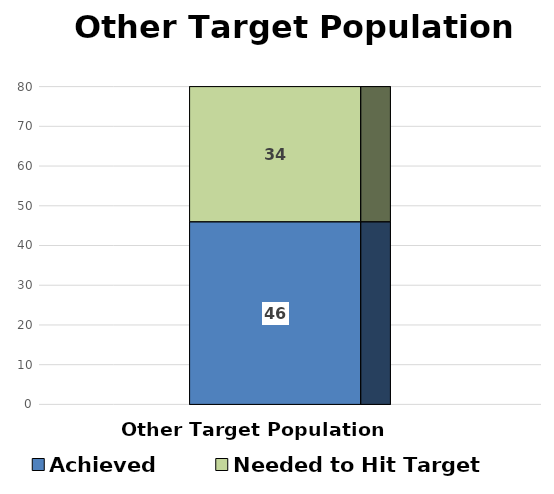
| Category | Achieved | Needed to Hit Target |
|---|---|---|
| Other Target Population | 46 | 34 |